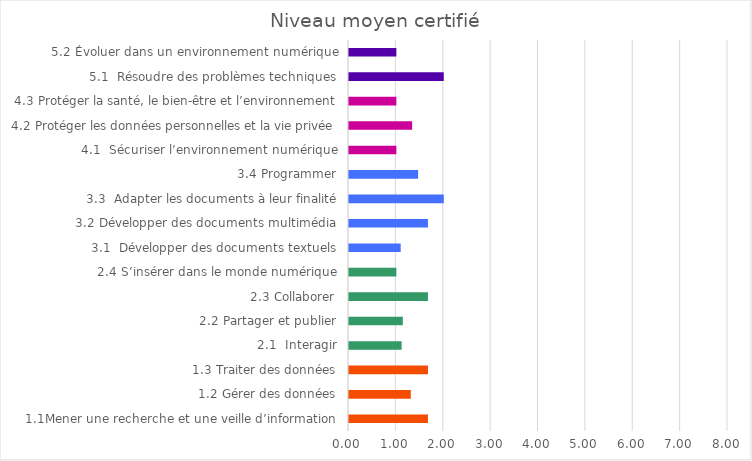
| Category | Series 0 |
|---|---|
| 1.1Mener une recherche et une veille d’information | 1.667 |
| 1.2 Gérer des données | 1.304 |
| 1.3 Traiter des données | 1.667 |
| 2.1  Interagir | 1.111 |
| 2.2 Partager et publier | 1.136 |
| 2.3 Collaborer | 1.667 |
| 2.4 S’insérer dans le monde numérique | 1 |
| 3.1  Développer des documents textuels | 1.091 |
| 3.2 Développer des documents multimédia | 1.667 |
| 3.3  Adapter les documents à leur finalité | 2 |
| 3.4 Programmer | 1.458 |
| 4.1  Sécuriser l’environnement numérique | 1 |
| 4.2 Protéger les données personnelles et la vie privée | 1.333 |
| 4.3 Protéger la santé, le bien-être et l’environnement | 1 |
| 5.1  Résoudre des problèmes techniques | 2 |
| 5.2 Évoluer dans un environnement numérique | 1 |